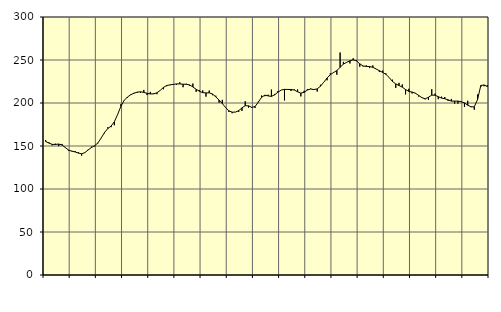
| Category | Piggar | Series 1 |
|---|---|---|
| nan | 156.8 | 155.26 |
| 87.0 | 154.3 | 153.41 |
| 87.0 | 150.8 | 151.91 |
| 87.0 | 152.7 | 151.8 |
| nan | 149.8 | 152.28 |
| 88.0 | 152.4 | 151.2 |
| 88.0 | 147.9 | 148.25 |
| 88.0 | 144.5 | 145.29 |
| nan | 144.4 | 143.92 |
| 89.0 | 144.2 | 143.1 |
| 89.0 | 142.8 | 141.74 |
| 89.0 | 138.8 | 140.97 |
| nan | 142.5 | 142.31 |
| 90.0 | 145.8 | 145.43 |
| 90.0 | 149.2 | 148.23 |
| 90.0 | 149.6 | 150.35 |
| nan | 153.2 | 153.68 |
| 91.0 | 159.7 | 159.4 |
| 91.0 | 164.8 | 165.78 |
| 91.0 | 171.8 | 170.29 |
| nan | 171.9 | 173.19 |
| 92.0 | 174.1 | 178.11 |
| 92.0 | 186.4 | 186.65 |
| 92.0 | 198.6 | 196.1 |
| nan | 203.3 | 203.06 |
| 93.0 | 206.2 | 206.97 |
| 93.0 | 210 | 209.58 |
| 93.0 | 211.8 | 211.34 |
| nan | 212 | 212.65 |
| 94.0 | 212 | 213.04 |
| 94.0 | 215.2 | 212.36 |
| 94.0 | 209.2 | 211.29 |
| nan | 212.9 | 210.49 |
| 95.0 | 211.2 | 210.64 |
| 95.0 | 210.2 | 211.81 |
| 95.0 | 214.6 | 214.59 |
| nan | 216 | 218.09 |
| 96.0 | 219.6 | 220.32 |
| 96.0 | 221.2 | 221.05 |
| 96.0 | 221.5 | 221.63 |
| nan | 220.9 | 222.18 |
| 97.0 | 224.1 | 222.21 |
| 97.0 | 218.4 | 221.85 |
| 97.0 | 222.4 | 221.75 |
| nan | 220.2 | 221.01 |
| 98.0 | 222.6 | 218.71 |
| 98.0 | 213 | 215.97 |
| 98.0 | 215.1 | 213.63 |
| nan | 214.7 | 212.01 |
| 99.0 | 207.4 | 211.71 |
| 99.0 | 214.5 | 211.8 |
| 99.0 | 209.1 | 210.44 |
| nan | 208.5 | 207.21 |
| 0.0 | 200.4 | 203.34 |
| 0.0 | 203.6 | 199.32 |
| 0.0 | 195 | 194.69 |
| nan | 189.6 | 190.92 |
| 1.0 | 188.1 | 189.34 |
| 1.0 | 189.3 | 189.43 |
| 1.0 | 189.6 | 191.1 |
| nan | 190.8 | 194.32 |
| 2.0 | 202 | 196.85 |
| 2.0 | 194.7 | 196.7 |
| 2.0 | 195.3 | 194.89 |
| nan | 194.2 | 195.93 |
| 3.0 | 201.6 | 201.01 |
| 3.0 | 208.7 | 206.61 |
| 3.0 | 207.9 | 209.14 |
| nan | 209.6 | 208.24 |
| 4.0 | 215.6 | 207.68 |
| 4.0 | 210.5 | 209.52 |
| 4.0 | 214 | 212.63 |
| nan | 215 | 215.05 |
| 5.0 | 203 | 215.85 |
| 5.0 | 216.2 | 215.75 |
| 5.0 | 213.9 | 215.72 |
| nan | 215.7 | 215.07 |
| 6.0 | 215.7 | 213.04 |
| 6.0 | 207.7 | 211.53 |
| 6.0 | 214.2 | 212.37 |
| nan | 216.3 | 215.06 |
| 7.0 | 216.8 | 216.28 |
| 7.0 | 216 | 215.62 |
| 7.0 | 213.3 | 216.43 |
| nan | 221.2 | 219.5 |
| 8.0 | 224.1 | 224.13 |
| 8.0 | 226.4 | 228.98 |
| 8.0 | 234.5 | 232.95 |
| nan | 235.8 | 235.44 |
| 9.0 | 232.9 | 237.74 |
| 9.0 | 258.7 | 241.49 |
| 9.0 | 247.8 | 245.15 |
| nan | 247.6 | 247.31 |
| 10.0 | 246 | 249.04 |
| 10.0 | 252 | 250.22 |
| 10.0 | 249.8 | 248.94 |
| nan | 242.2 | 245.57 |
| 11.0 | 242.6 | 243.1 |
| 11.0 | 243.7 | 242.53 |
| 11.0 | 240.6 | 242.41 |
| nan | 243.7 | 241.48 |
| 12.0 | 239.5 | 239.56 |
| 12.0 | 236 | 237.58 |
| 12.0 | 237.7 | 235.59 |
| nan | 234.4 | 233.32 |
| 13.0 | 229.4 | 229.61 |
| 13.0 | 227.1 | 225.04 |
| 13.0 | 217.5 | 222.15 |
| nan | 223.4 | 220.4 |
| 14.0 | 221.6 | 218.41 |
| 14.0 | 210 | 215.69 |
| 14.0 | 216.5 | 213.47 |
| nan | 211.1 | 212.73 |
| 15.0 | 211.7 | 211.36 |
| 15.0 | 207.5 | 208.84 |
| 15.0 | 206.6 | 206.19 |
| nan | 204.3 | 204.84 |
| 16.0 | 203.5 | 206.7 |
| 16.0 | 216 | 209.09 |
| 16.0 | 210.9 | 209.07 |
| nan | 204.4 | 207.3 |
| 17.0 | 207.4 | 205.74 |
| 17.0 | 206.9 | 204.94 |
| 17.0 | 202.4 | 203.64 |
| nan | 204.7 | 202.23 |
| 18.0 | 199.3 | 202.2 |
| 18.0 | 199.3 | 202.24 |
| 18.0 | 201.9 | 201.54 |
| nan | 195.4 | 200.11 |
| 19.0 | 202.6 | 197.45 |
| 19.0 | 195.2 | 195.6 |
| 19.0 | 192.2 | 195.53 |
| nan | 209.9 | 204.06 |
| 20.0 | 218.7 | 220.39 |
| 20.0 | 219.5 | 221 |
| 20.0 | 220.7 | 219.1 |